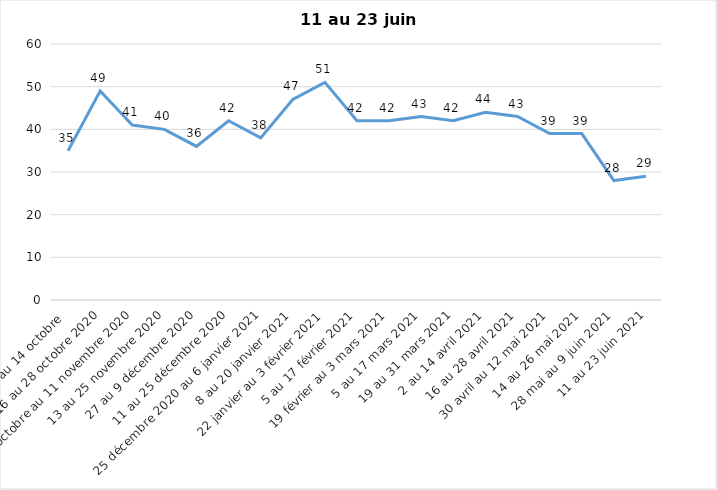
| Category | Toujours aux trois mesures |
|---|---|
| 2 au 14 octobre  | 35 |
| 16 au 28 octobre 2020 | 49 |
| 30 octobre au 11 novembre 2020 | 41 |
| 13 au 25 novembre 2020 | 40 |
| 27 au 9 décembre 2020 | 36 |
| 11 au 25 décembre 2020 | 42 |
| 25 décembre 2020 au 6 janvier 2021 | 38 |
| 8 au 20 janvier 2021 | 47 |
| 22 janvier au 3 février 2021 | 51 |
| 5 au 17 février 2021 | 42 |
| 19 février au 3 mars 2021 | 42 |
| 5 au 17 mars 2021 | 43 |
| 19 au 31 mars 2021 | 42 |
| 2 au 14 avril 2021 | 44 |
| 16 au 28 avril 2021 | 43 |
| 30 avril au 12 mai 2021 | 39 |
| 14 au 26 mai 2021 | 39 |
| 28 mai au 9 juin 2021 | 28 |
| 11 au 23 juin 2021 | 29 |